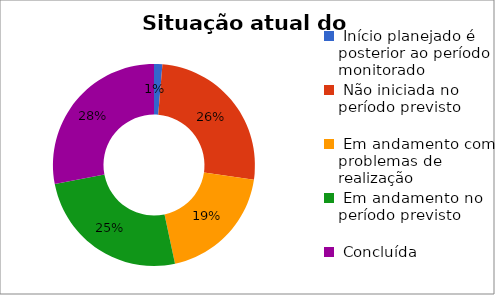
| Category | Series 0 |
|---|---|
|  Início planejado é posterior ao período monitorado | 0.013 |
|  Não iniciada no período previsto | 0.26 |
|  Em andamento com problemas de realização | 0.193 |
|  Em andamento no período previsto  | 0.253 |
|  Concluída | 0.28 |